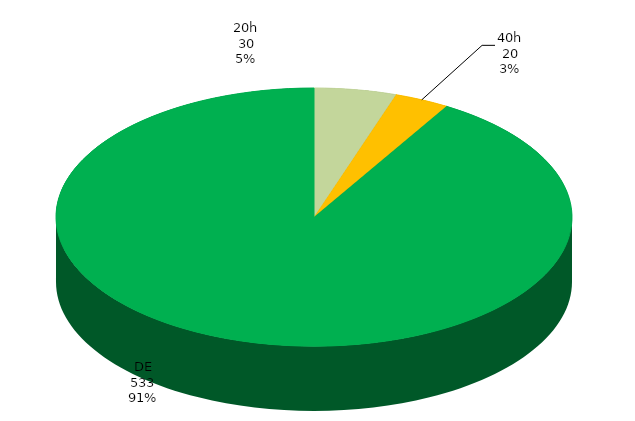
| Category | Total Geral |
|---|---|
| 20h | 30 |
| 40h | 20 |
| DE | 533 |